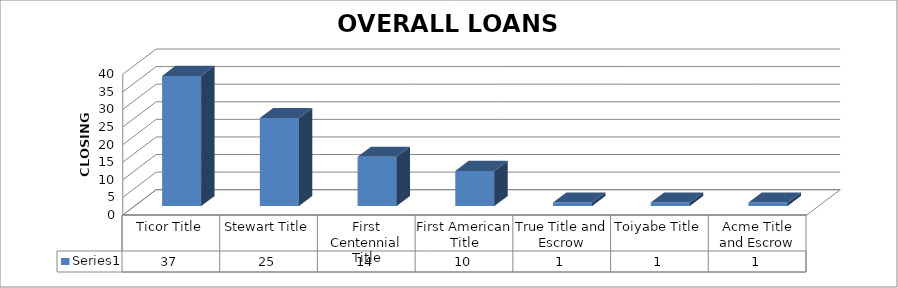
| Category | Series 0 |
|---|---|
| Ticor Title | 37 |
| Stewart Title | 25 |
| First Centennial Title | 14 |
| First American Title | 10 |
| True Title and Escrow | 1 |
| Toiyabe Title | 1 |
| Acme Title and Escrow | 1 |